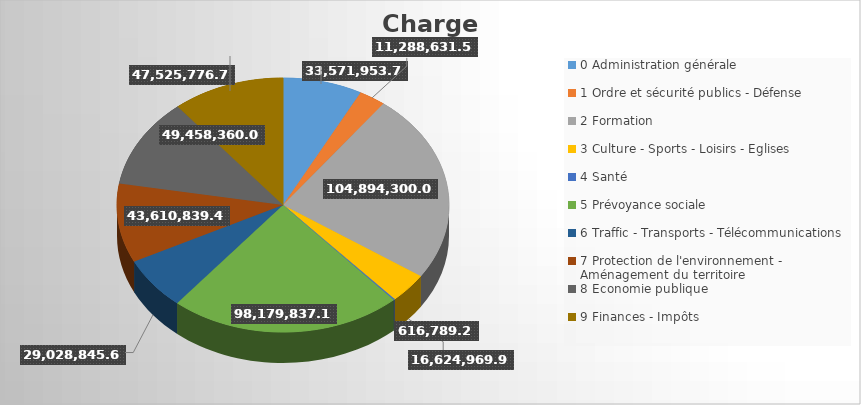
| Category | Series 0 |
|---|---|
| 0 Administration générale | 33571953.77 |
| 1 Ordre et sécurité publics - Défense | 11288631.56 |
| 2 Formation | 104894300.07 |
| 3 Culture - Sports - Loisirs - Eglises | 16624969.9 |
| 4 Santé | 616789.23 |
| 5 Prévoyance sociale | 98179837.12 |
| 6 Traffic - Transports - Télécommunications | 29028845.61 |
| 7 Protection de l'environnement - Aménagement du territoire | 43610839.49 |
| 8 Economie publique | 49458360.01 |
| 9 Finances - Impôts | 47525776.79 |